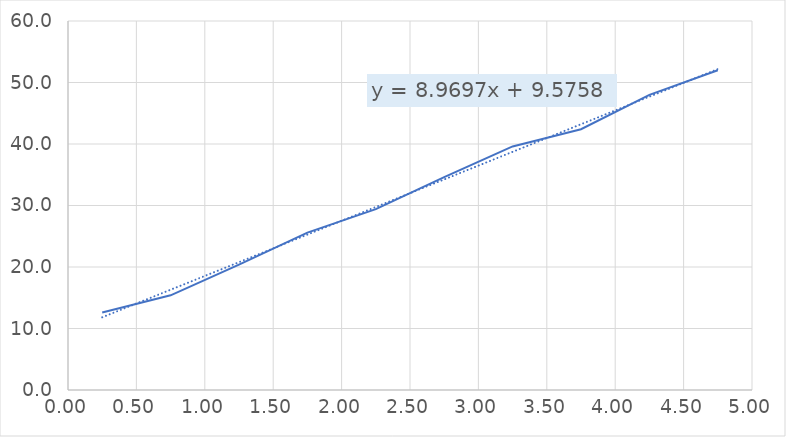
| Category | Series 0 |
|---|---|
| 0.25 | 12.6 |
| 0.75 | 15.4 |
| 1.25 | 20.4 |
| 1.75 | 25.6 |
| 2.25 | 29.4 |
| 2.75 | 34.6 |
| 3.25 | 39.6 |
| 3.75 | 42.4 |
| 4.25 | 48 |
| 4.75 | 52 |